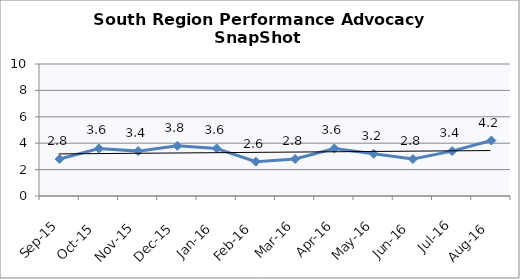
| Category | South Region |
|---|---|
| Sep-15 | 2.8 |
| Oct-15 | 3.6 |
| Nov-15 | 3.4 |
| Dec-15 | 3.8 |
| Jan-16 | 3.6 |
| Feb-16 | 2.6 |
| Mar-16 | 2.8 |
| Apr-16 | 3.6 |
| May-16 | 3.2 |
| Jun-16 | 2.8 |
| Jul-16 | 3.4 |
| Aug-16 | 4.2 |